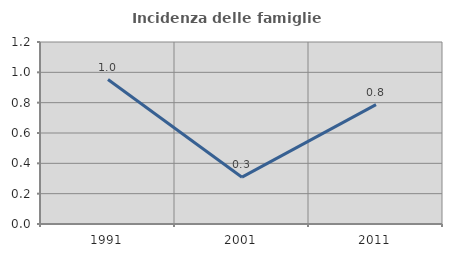
| Category | Incidenza delle famiglie numerose |
|---|---|
| 1991.0 | 0.952 |
| 2001.0 | 0.309 |
| 2011.0 | 0.787 |